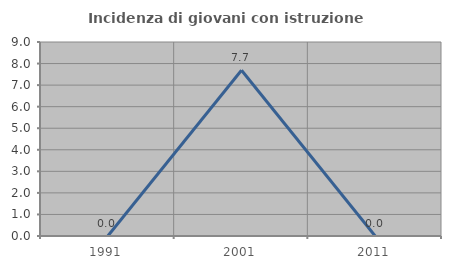
| Category | Incidenza di giovani con istruzione universitaria |
|---|---|
| 1991.0 | 0 |
| 2001.0 | 7.692 |
| 2011.0 | 0 |